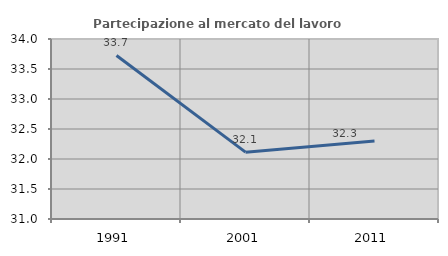
| Category | Partecipazione al mercato del lavoro  femminile |
|---|---|
| 1991.0 | 33.725 |
| 2001.0 | 32.114 |
| 2011.0 | 32.301 |